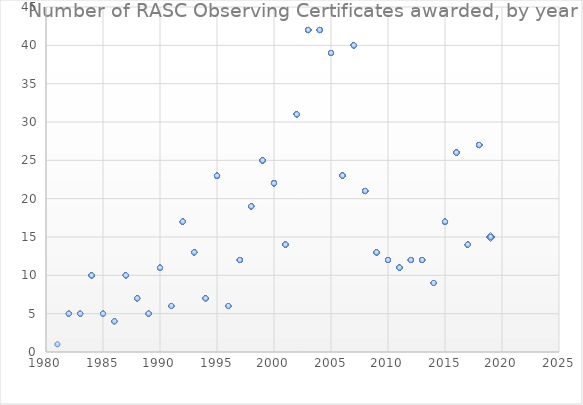
| Category | Series 0 |
|---|---|
| 2019.0 | 15 |
| 2019.0 | 15 |
| 2019.0 | 15 |
| 2019.0 | 15 |
| 2019.0 | 15 |
| 2019.0 | 15 |
| 2019.0 | 15 |
| 2019.0 | 15 |
| 2019.0 | 15 |
| 2018.0 | 27 |
| 2018.0 | 27 |
| 2018.0 | 27 |
| 2018.0 | 27 |
| 2018.0 | 27 |
| 2018.0 | 27 |
| 2018.0 | 27 |
| 2018.0 | 27 |
| 2018.0 | 27 |
| 2018.0 | 27 |
| 2018.0 | 27 |
| 2018.0 | 27 |
| 2018.0 | 27 |
| 2018.0 | 27 |
| 2018.0 | 27 |
| 2018.0 | 27 |
| 2018.0 | 27 |
| 2018.0 | 27 |
| 2018.0 | 27 |
| 2018.0 | 27 |
| 2018.0 | 27 |
| 2018.0 | 27 |
| 2018.0 | 27 |
| 2018.0 | 27 |
| 2018.0 | 27 |
| 2018.0 | 27 |
| 2018.0 | 27 |
| 2017.0 | 14 |
| 2017.0 | 14 |
| 2017.0 | 14 |
| 2017.0 | 14 |
| 2017.0 | 14 |
| 2017.0 | 14 |
| 2017.0 | 14 |
| 2017.0 | 14 |
| 2017.0 | 14 |
| 2017.0 | 14 |
| 2017.0 | 14 |
| 2017.0 | 14 |
| 2017.0 | 14 |
| 2017.0 | 14 |
| 2016.0 | 26 |
| 2016.0 | 26 |
| 2016.0 | 26 |
| 2016.0 | 26 |
| 2016.0 | 26 |
| 2016.0 | 26 |
| 2016.0 | 26 |
| 2016.0 | 26 |
| 2016.0 | 26 |
| 2016.0 | 26 |
| 2016.0 | 26 |
| 2016.0 | 26 |
| 2016.0 | 26 |
| 2016.0 | 26 |
| 2016.0 | 26 |
| 2016.0 | 26 |
| 2016.0 | 26 |
| 2016.0 | 26 |
| 2016.0 | 26 |
| 2016.0 | 26 |
| 2016.0 | 26 |
| 2016.0 | 26 |
| 2016.0 | 26 |
| 2016.0 | 26 |
| 2016.0 | 26 |
| 2016.0 | 26 |
| 2015.0 | 17 |
| 2015.0 | 17 |
| 2015.0 | 17 |
| 2015.0 | 17 |
| 2015.0 | 17 |
| 2015.0 | 17 |
| 2015.0 | 17 |
| 2015.0 | 17 |
| 2015.0 | 17 |
| 2015.0 | 17 |
| 2015.0 | 17 |
| 2015.0 | 17 |
| 2015.0 | 17 |
| 2015.0 | 17 |
| 2015.0 | 17 |
| 2015.0 | 17 |
| 2015.0 | 17 |
| 2014.0 | 9 |
| 2014.0 | 9 |
| 2014.0 | 9 |
| 2014.0 | 9 |
| 2014.0 | 9 |
| 2014.0 | 9 |
| 2014.0 | 9 |
| 2014.0 | 9 |
| 2014.0 | 9 |
| 2013.0 | 12 |
| 2013.0 | 12 |
| 2013.0 | 12 |
| 2013.0 | 12 |
| 2013.0 | 12 |
| 2013.0 | 12 |
| 2013.0 | 12 |
| 2013.0 | 12 |
| 2013.0 | 12 |
| 2013.0 | 12 |
| 2013.0 | 12 |
| 2013.0 | 12 |
| 2012.0 | 12 |
| 2012.0 | 12 |
| 2012.0 | 12 |
| 2012.0 | 12 |
| 2012.0 | 12 |
| 2012.0 | 12 |
| 2012.0 | 12 |
| 2012.0 | 12 |
| 2012.0 | 12 |
| 2012.0 | 12 |
| 2012.0 | 12 |
| 2012.0 | 12 |
| 2011.0 | 11 |
| 2011.0 | 11 |
| 2011.0 | 11 |
| 2011.0 | 11 |
| 2011.0 | 11 |
| 2011.0 | 11 |
| 2011.0 | 11 |
| 2011.0 | 11 |
| 2011.0 | 11 |
| 2011.0 | 11 |
| 2011.0 | 11 |
| 2010.0 | 12 |
| 2010.0 | 12 |
| 2010.0 | 12 |
| 2010.0 | 12 |
| 2010.0 | 12 |
| 2010.0 | 12 |
| 2010.0 | 12 |
| 2010.0 | 12 |
| 2010.0 | 12 |
| 2010.0 | 12 |
| 2010.0 | 12 |
| 2010.0 | 12 |
| 2009.0 | 13 |
| 2009.0 | 13 |
| 2009.0 | 13 |
| 2009.0 | 13 |
| 2009.0 | 13 |
| 2009.0 | 13 |
| 2009.0 | 13 |
| 2009.0 | 13 |
| 2009.0 | 13 |
| 2009.0 | 13 |
| 2009.0 | 13 |
| 2009.0 | 13 |
| 2009.0 | 13 |
| 2008.0 | 21 |
| 2008.0 | 21 |
| 2008.0 | 21 |
| 2008.0 | 21 |
| 2008.0 | 21 |
| 2008.0 | 21 |
| 2008.0 | 21 |
| 2008.0 | 21 |
| 2008.0 | 21 |
| 2008.0 | 21 |
| 2008.0 | 21 |
| 2008.0 | 21 |
| 2008.0 | 21 |
| 2008.0 | 21 |
| 2008.0 | 21 |
| 2008.0 | 21 |
| 2008.0 | 21 |
| 2008.0 | 21 |
| 2008.0 | 21 |
| 2008.0 | 21 |
| 2008.0 | 21 |
| 2007.0 | 40 |
| 2007.0 | 40 |
| 2007.0 | 40 |
| 2007.0 | 40 |
| 2007.0 | 40 |
| 2007.0 | 40 |
| 2007.0 | 40 |
| 2007.0 | 40 |
| 2007.0 | 40 |
| 2007.0 | 40 |
| 2007.0 | 40 |
| 2007.0 | 40 |
| 2007.0 | 40 |
| 2007.0 | 40 |
| 2007.0 | 40 |
| 2007.0 | 40 |
| 2007.0 | 40 |
| 2007.0 | 40 |
| 2007.0 | 40 |
| 2007.0 | 40 |
| 2007.0 | 40 |
| 2007.0 | 40 |
| 2007.0 | 40 |
| 2007.0 | 40 |
| 2007.0 | 40 |
| 2007.0 | 40 |
| 2007.0 | 40 |
| 2007.0 | 40 |
| 2007.0 | 40 |
| 2007.0 | 40 |
| 2007.0 | 40 |
| 2007.0 | 40 |
| 2007.0 | 40 |
| 2007.0 | 40 |
| 2007.0 | 40 |
| 2007.0 | 40 |
| 2007.0 | 40 |
| 2007.0 | 40 |
| 2007.0 | 40 |
| 2007.0 | 40 |
| 2006.0 | 23 |
| 2006.0 | 23 |
| 2006.0 | 23 |
| 2006.0 | 23 |
| 2006.0 | 23 |
| 2006.0 | 23 |
| 2006.0 | 23 |
| 2006.0 | 23 |
| 2006.0 | 23 |
| 2006.0 | 23 |
| 2006.0 | 23 |
| 2006.0 | 23 |
| 2006.0 | 23 |
| 2006.0 | 23 |
| 2006.0 | 23 |
| 2006.0 | 23 |
| 2006.0 | 23 |
| 2006.0 | 23 |
| 2006.0 | 23 |
| 2006.0 | 23 |
| 2006.0 | 23 |
| 2006.0 | 23 |
| 2006.0 | 23 |
| 2005.0 | 39 |
| 2005.0 | 39 |
| 2005.0 | 39 |
| 2005.0 | 39 |
| 2005.0 | 39 |
| 2005.0 | 39 |
| 2005.0 | 39 |
| 2005.0 | 39 |
| 2005.0 | 39 |
| 2005.0 | 39 |
| 2005.0 | 39 |
| 2005.0 | 39 |
| 2005.0 | 39 |
| 2005.0 | 39 |
| 2005.0 | 39 |
| 2005.0 | 39 |
| 2005.0 | 39 |
| 2005.0 | 39 |
| 2005.0 | 39 |
| 2005.0 | 39 |
| 2005.0 | 39 |
| 2005.0 | 39 |
| 2005.0 | 39 |
| 2005.0 | 39 |
| 2005.0 | 39 |
| 2005.0 | 39 |
| 2005.0 | 39 |
| 2005.0 | 39 |
| 2005.0 | 39 |
| 2005.0 | 39 |
| 2005.0 | 39 |
| 2005.0 | 39 |
| 2005.0 | 39 |
| 2005.0 | 39 |
| 2005.0 | 39 |
| 2005.0 | 39 |
| 2005.0 | 39 |
| 2005.0 | 39 |
| 2005.0 | 39 |
| 2004.0 | 42 |
| 2004.0 | 42 |
| 2004.0 | 42 |
| 2004.0 | 42 |
| 2004.0 | 42 |
| 2004.0 | 42 |
| 2004.0 | 42 |
| 2004.0 | 42 |
| 2004.0 | 42 |
| 2004.0 | 42 |
| 2004.0 | 42 |
| 2004.0 | 42 |
| 2004.0 | 42 |
| 2004.0 | 42 |
| 2004.0 | 42 |
| 2004.0 | 42 |
| 2004.0 | 42 |
| 2004.0 | 42 |
| 2004.0 | 42 |
| 2004.0 | 42 |
| 2004.0 | 42 |
| 2004.0 | 42 |
| 2004.0 | 42 |
| 2004.0 | 42 |
| 2004.0 | 42 |
| 2004.0 | 42 |
| 2004.0 | 42 |
| 2004.0 | 42 |
| 2004.0 | 42 |
| 2004.0 | 42 |
| 2004.0 | 42 |
| 2004.0 | 42 |
| 2004.0 | 42 |
| 2004.0 | 42 |
| 2004.0 | 42 |
| 2004.0 | 42 |
| 2004.0 | 42 |
| 2004.0 | 42 |
| 2004.0 | 42 |
| 2004.0 | 42 |
| 2004.0 | 42 |
| 2004.0 | 42 |
| 2003.0 | 42 |
| 2003.0 | 42 |
| 2003.0 | 42 |
| 2003.0 | 42 |
| 2003.0 | 42 |
| 2003.0 | 42 |
| 2003.0 | 42 |
| 2003.0 | 42 |
| 2003.0 | 42 |
| 2003.0 | 42 |
| 2003.0 | 42 |
| 2003.0 | 42 |
| 2003.0 | 42 |
| 2003.0 | 42 |
| 2003.0 | 42 |
| 2003.0 | 42 |
| 2003.0 | 42 |
| 2003.0 | 42 |
| 2003.0 | 42 |
| 2003.0 | 42 |
| 2003.0 | 42 |
| 2003.0 | 42 |
| 2003.0 | 42 |
| 2003.0 | 42 |
| 2003.0 | 42 |
| 2003.0 | 42 |
| 2003.0 | 42 |
| 2003.0 | 42 |
| 2003.0 | 42 |
| 2003.0 | 42 |
| 2003.0 | 42 |
| 2003.0 | 42 |
| 2003.0 | 42 |
| 2003.0 | 42 |
| 2003.0 | 42 |
| 2003.0 | 42 |
| 2003.0 | 42 |
| 2003.0 | 42 |
| 2003.0 | 42 |
| 2003.0 | 42 |
| 2003.0 | 42 |
| 2003.0 | 42 |
| 2002.0 | 31 |
| 2002.0 | 31 |
| 2002.0 | 31 |
| 2002.0 | 31 |
| 2002.0 | 31 |
| 2002.0 | 31 |
| 2002.0 | 31 |
| 2002.0 | 31 |
| 2002.0 | 31 |
| 2002.0 | 31 |
| 2002.0 | 31 |
| 2002.0 | 31 |
| 2002.0 | 31 |
| 2002.0 | 31 |
| 2002.0 | 31 |
| 2002.0 | 31 |
| 2002.0 | 31 |
| 2002.0 | 31 |
| 2002.0 | 31 |
| 2002.0 | 31 |
| 2002.0 | 31 |
| 2002.0 | 31 |
| 2002.0 | 31 |
| 2002.0 | 31 |
| 2002.0 | 31 |
| 2002.0 | 31 |
| 2002.0 | 31 |
| 2002.0 | 31 |
| 2002.0 | 31 |
| 2002.0 | 31 |
| 2002.0 | 31 |
| 2001.0 | 14 |
| 2001.0 | 14 |
| 2001.0 | 14 |
| 2001.0 | 14 |
| 2001.0 | 14 |
| 2001.0 | 14 |
| 2001.0 | 14 |
| 2001.0 | 14 |
| 2001.0 | 14 |
| 2001.0 | 14 |
| 2001.0 | 14 |
| 2001.0 | 14 |
| 2001.0 | 14 |
| 2001.0 | 14 |
| 2000.0 | 22 |
| 2000.0 | 22 |
| 2000.0 | 22 |
| 2000.0 | 22 |
| 2000.0 | 22 |
| 2000.0 | 22 |
| 2000.0 | 22 |
| 2000.0 | 22 |
| 2000.0 | 22 |
| 2000.0 | 22 |
| 2000.0 | 22 |
| 2000.0 | 22 |
| 2000.0 | 22 |
| 2000.0 | 22 |
| 2000.0 | 22 |
| 2000.0 | 22 |
| 2000.0 | 22 |
| 2000.0 | 22 |
| 2000.0 | 22 |
| 2000.0 | 22 |
| 2000.0 | 22 |
| 2000.0 | 22 |
| 1999.0 | 25 |
| 1999.0 | 25 |
| 1999.0 | 25 |
| 1999.0 | 25 |
| 1999.0 | 25 |
| 1999.0 | 25 |
| 1999.0 | 25 |
| 1999.0 | 25 |
| 1999.0 | 25 |
| 1999.0 | 25 |
| 1999.0 | 25 |
| 1999.0 | 25 |
| 1999.0 | 25 |
| 1999.0 | 25 |
| 1999.0 | 25 |
| 1999.0 | 25 |
| 1999.0 | 25 |
| 1999.0 | 25 |
| 1999.0 | 25 |
| 1999.0 | 25 |
| 1999.0 | 25 |
| 1999.0 | 25 |
| 1999.0 | 25 |
| 1999.0 | 25 |
| 1999.0 | 25 |
| 1998.0 | 19 |
| 1998.0 | 19 |
| 1998.0 | 19 |
| 1998.0 | 19 |
| 1998.0 | 19 |
| 1998.0 | 19 |
| 1998.0 | 19 |
| 1998.0 | 19 |
| 1998.0 | 19 |
| 1998.0 | 19 |
| 1998.0 | 19 |
| 1998.0 | 19 |
| 1998.0 | 19 |
| 1998.0 | 19 |
| 1998.0 | 19 |
| 1998.0 | 19 |
| 1998.0 | 19 |
| 1998.0 | 19 |
| 1998.0 | 19 |
| 1997.0 | 12 |
| 1997.0 | 12 |
| 1997.0 | 12 |
| 1997.0 | 12 |
| 1997.0 | 12 |
| 1997.0 | 12 |
| 1997.0 | 12 |
| 1997.0 | 12 |
| 1997.0 | 12 |
| 1997.0 | 12 |
| 1997.0 | 12 |
| 1997.0 | 12 |
| 1996.0 | 6 |
| 1996.0 | 6 |
| 1996.0 | 6 |
| 1996.0 | 6 |
| 1996.0 | 6 |
| 1996.0 | 6 |
| 1995.0 | 23 |
| 1995.0 | 23 |
| 1995.0 | 23 |
| 1995.0 | 23 |
| 1995.0 | 23 |
| 1995.0 | 23 |
| 1995.0 | 23 |
| 1995.0 | 23 |
| 1995.0 | 23 |
| 1995.0 | 23 |
| 1995.0 | 23 |
| 1995.0 | 23 |
| 1995.0 | 23 |
| 1995.0 | 23 |
| 1995.0 | 23 |
| 1995.0 | 23 |
| 1995.0 | 23 |
| 1995.0 | 23 |
| 1995.0 | 23 |
| 1995.0 | 23 |
| 1995.0 | 23 |
| 1995.0 | 23 |
| 1995.0 | 23 |
| 1994.0 | 7 |
| 1994.0 | 7 |
| 1994.0 | 7 |
| 1994.0 | 7 |
| 1994.0 | 7 |
| 1994.0 | 7 |
| 1994.0 | 7 |
| 1993.0 | 13 |
| 1993.0 | 13 |
| 1993.0 | 13 |
| 1993.0 | 13 |
| 1993.0 | 13 |
| 1993.0 | 13 |
| 1993.0 | 13 |
| 1993.0 | 13 |
| 1993.0 | 13 |
| 1993.0 | 13 |
| 1993.0 | 13 |
| 1993.0 | 13 |
| 1993.0 | 13 |
| 1992.0 | 17 |
| 1992.0 | 17 |
| 1992.0 | 17 |
| 1992.0 | 17 |
| 1992.0 | 17 |
| 1992.0 | 17 |
| 1992.0 | 17 |
| 1992.0 | 17 |
| 1992.0 | 17 |
| 1992.0 | 17 |
| 1992.0 | 17 |
| 1992.0 | 17 |
| 1992.0 | 17 |
| 1992.0 | 17 |
| 1992.0 | 17 |
| 1992.0 | 17 |
| 1992.0 | 17 |
| 1991.0 | 6 |
| 1991.0 | 6 |
| 1991.0 | 6 |
| 1991.0 | 6 |
| 1991.0 | 6 |
| 1991.0 | 6 |
| 1990.0 | 11 |
| 1990.0 | 11 |
| 1990.0 | 11 |
| 1990.0 | 11 |
| 1990.0 | 11 |
| 1990.0 | 11 |
| 1990.0 | 11 |
| 1990.0 | 11 |
| 1990.0 | 11 |
| 1990.0 | 11 |
| 1990.0 | 11 |
| 1989.0 | 5 |
| 1989.0 | 5 |
| 1989.0 | 5 |
| 1989.0 | 5 |
| 1989.0 | 5 |
| 1988.0 | 7 |
| 1988.0 | 7 |
| 1988.0 | 7 |
| 1988.0 | 7 |
| 1988.0 | 7 |
| 1988.0 | 7 |
| 1988.0 | 7 |
| 1987.0 | 10 |
| 1987.0 | 10 |
| 1987.0 | 10 |
| 1987.0 | 10 |
| 1987.0 | 10 |
| 1987.0 | 10 |
| 1987.0 | 10 |
| 1987.0 | 10 |
| 1987.0 | 10 |
| 1987.0 | 10 |
| 1986.0 | 4 |
| 1986.0 | 4 |
| 1986.0 | 4 |
| 1986.0 | 4 |
| 1985.0 | 5 |
| 1985.0 | 5 |
| 1985.0 | 5 |
| 1985.0 | 5 |
| 1985.0 | 5 |
| 1984.0 | 10 |
| 1984.0 | 10 |
| 1984.0 | 10 |
| 1984.0 | 10 |
| 1984.0 | 10 |
| 1984.0 | 10 |
| 1984.0 | 10 |
| 1984.0 | 10 |
| 1984.0 | 10 |
| 1984.0 | 10 |
| 1983.0 | 5 |
| 1983.0 | 5 |
| 1983.0 | 5 |
| 1983.0 | 5 |
| 1983.0 | 5 |
| 1982.0 | 5 |
| 1982.0 | 5 |
| 1982.0 | 5 |
| 1982.0 | 5 |
| 1982.0 | 5 |
| 1981.0 | 1 |